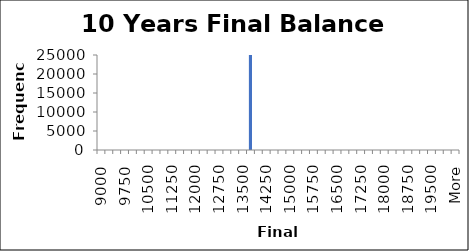
| Category | Frequency |
|---|---|
| 9000.0 | 0 |
| 9250.0 | 0 |
| 9500.0 | 0 |
| 9750.0 | 0 |
| 10000.0 | 0 |
| 10250.0 | 0 |
| 10500.0 | 0 |
| 10750.0 | 0 |
| 11000.0 | 0 |
| 11250.0 | 0 |
| 11500.0 | 0 |
| 11750.0 | 0 |
| 12000.0 | 0 |
| 12250.0 | 0 |
| 12500.0 | 0 |
| 12750.0 | 0 |
| 13000.0 | 0 |
| 13250.0 | 0 |
| 13500.0 | 0 |
| 13750.0 | 25000 |
| 14000.0 | 0 |
| 14250.0 | 0 |
| 14500.0 | 0 |
| 14750.0 | 0 |
| 15000.0 | 0 |
| 15250.0 | 0 |
| 15500.0 | 0 |
| 15750.0 | 0 |
| 16000.0 | 0 |
| 16250.0 | 0 |
| 16500.0 | 0 |
| 16750.0 | 0 |
| 17000.0 | 0 |
| 17250.0 | 0 |
| 17500.0 | 0 |
| 17750.0 | 0 |
| 18000.0 | 0 |
| 18250.0 | 0 |
| 18500.0 | 0 |
| 18750.0 | 0 |
| 19000.0 | 0 |
| 19250.0 | 0 |
| 19500.0 | 0 |
| 19750.0 | 0 |
| 20000.0 | 0 |
| More | 0 |